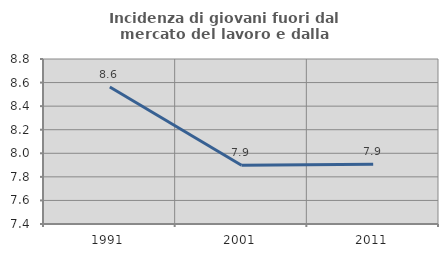
| Category | Incidenza di giovani fuori dal mercato del lavoro e dalla formazione  |
|---|---|
| 1991.0 | 8.562 |
| 2001.0 | 7.899 |
| 2011.0 | 7.908 |